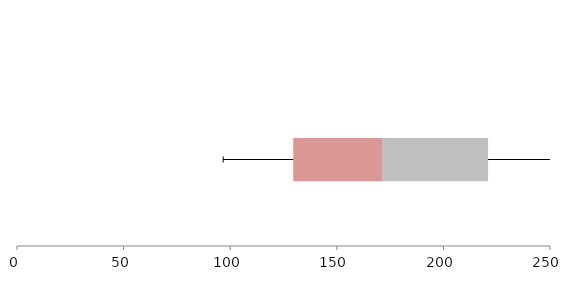
| Category | Series 1 | Series 2 | Series 3 |
|---|---|---|---|
| 0 | 129.563 | 41.961 | 49.435 |